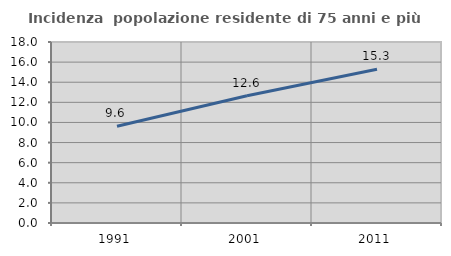
| Category | Incidenza  popolazione residente di 75 anni e più |
|---|---|
| 1991.0 | 9.628 |
| 2001.0 | 12.65 |
| 2011.0 | 15.284 |